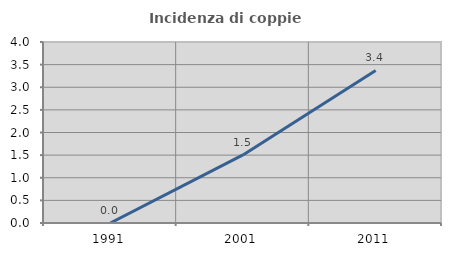
| Category | Incidenza di coppie miste |
|---|---|
| 1991.0 | 0 |
| 2001.0 | 1.504 |
| 2011.0 | 3.371 |